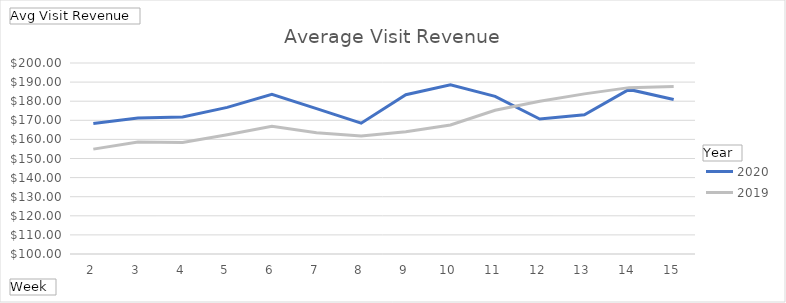
| Category | 2020 | 2019 |
|---|---|---|
| 2 | 168.32 | 154.904 |
| 3 | 171.257 | 158.671 |
| 4 | 171.765 | 158.354 |
| 5 | 176.78 | 162.399 |
| 6 | 183.654 | 166.912 |
| 7 | 176.123 | 163.448 |
| 8 | 168.484 | 161.81 |
| 9 | 183.374 | 164.061 |
| 10 | 188.562 | 167.579 |
| 11 | 182.531 | 175.255 |
| 12 | 170.65 | 179.966 |
| 13 | 172.905 | 183.841 |
| 14 | 186.159 | 187.105 |
| 15 | 180.868 | 187.732 |